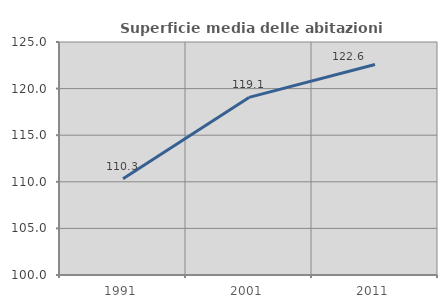
| Category | Superficie media delle abitazioni occupate |
|---|---|
| 1991.0 | 110.333 |
| 2001.0 | 119.057 |
| 2011.0 | 122.587 |